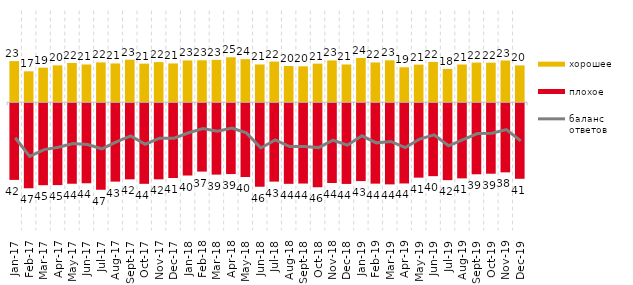
| Category | хорошее | плохое |
|---|---|---|
| 2017-01-01 | 22.55 | -42 |
| 2017-02-01 | 16.95 | -46.6 |
| 2017-03-01 | 18.95 | -44.9 |
| 2017-04-01 | 20.2 | -44.85 |
| 2017-05-01 | 21.5 | -44.1 |
| 2017-06-01 | 20.7 | -43.85 |
| 2017-07-01 | 21.85 | -47.35 |
| 2017-08-01 | 21.25 | -42.95 |
| 2017-09-01 | 23.3 | -41.7 |
| 2017-10-01 | 21.15 | -44.15 |
| 2017-11-01 | 22 | -41.7 |
| 2017-12-01 | 21.25 | -40.95 |
| 2018-01-01 | 22.9 | -39.6 |
| 2018-02-01 | 23 | -37.45 |
| 2018-03-01 | 23.2 | -39.1 |
| 2018-04-01 | 24.65 | -38.8 |
| 2018-05-01 | 23.6 | -40.4 |
| 2018-06-01 | 20.7 | -45.75 |
| 2018-07-01 | 22.3 | -42.95 |
| 2018-08-01 | 19.85 | -44.15 |
| 2018-09-01 | 19.7 | -44 |
| 2018-10-01 | 21.15 | -46 |
| 2018-11-01 | 22.904 | -43.713 |
| 2018-12-01 | 20.7 | -44.2 |
| 2019-01-01 | 24.25 | -42.65 |
| 2019-02-01 | 21.8 | -44.05 |
| 2019-03-01 | 22.974 | -44.455 |
| 2019-04-01 | 19.158 | -43.96 |
| 2019-05-01 | 20.604 | -40.763 |
| 2019-06-01 | 22.095 | -39.95 |
| 2019-07-01 | 18.267 | -42.129 |
| 2019-08-01 | 20.679 | -41.159 |
| 2019-09-01 | 21.733 | -38.911 |
| 2019-10-01 | 21.683 | -38.614 |
| 2019-11-01 | 22.871 | -37.871 |
| 2019-12-01 | 20.198 | -41.386 |